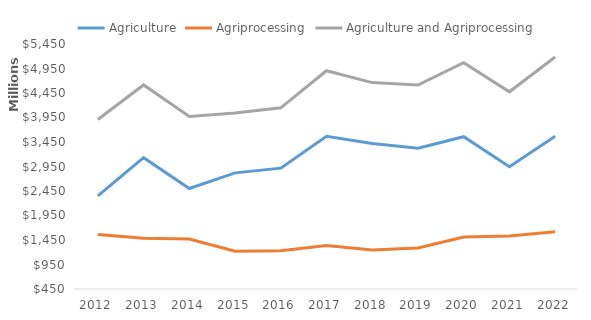
| Category | Agriculture | Agriprocessing | Agriculture and Agriprocessing |
|---|---|---|---|
| 2012 | 2349.8 | 1560.8 | 3910.6 |
| 2013 | 3129.2 | 1485.5 | 4614.7 |
| 2014 | 2500.9 | 1470.2 | 3971.1 |
| 2015 | 2820.4 | 1221.9 | 4042.3 |
| 2016 | 2916.5 | 1230.9 | 4147.4 |
| 2017 | 3565 | 1339.6 | 4904.6 |
| 2018 | 3417.9 | 1244 | 4661.9 |
| 2019 | 3323.6 | 1287.8 | 4611.4 |
| 2020 | 3557.4 | 1510.9 | 5068.3 |
| 2021 | 2944.3 | 1529.9 | 4474.2 |
| 2022 | 3566.8 | 1617.5 | 5184.3 |